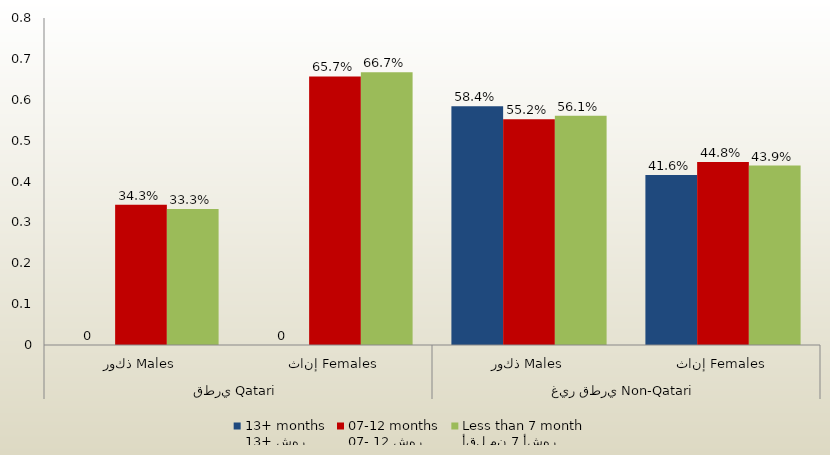
| Category | 13+ شهر
13+ months | 07- 12 شهر
07-12 months | أقل من 7 أشهر
Less than 7 month  |
|---|---|---|---|
| 0 | 0 | 0.343 | 0.333 |
| 1 | 0 | 0.657 | 0.667 |
| 2 | 0.584 | 0.552 | 0.561 |
| 3 | 0.416 | 0.448 | 0.439 |